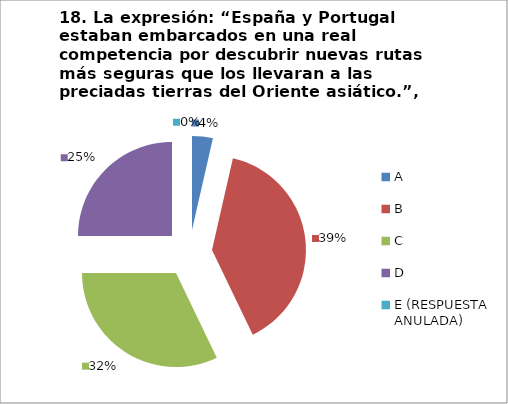
| Category | CANTIDAD DE RESPUESTAS PREGUNTA (18) | PORCENTAJE |
|---|---|---|
| A | 1 | 0.036 |
| B | 11 | 0.393 |
| C | 9 | 0.321 |
| D | 7 | 0.25 |
| E (RESPUESTA ANULADA) | 0 | 0 |